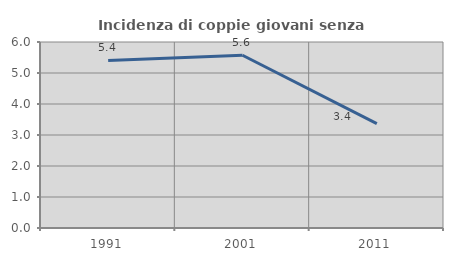
| Category | Incidenza di coppie giovani senza figli |
|---|---|
| 1991.0 | 5.405 |
| 2001.0 | 5.574 |
| 2011.0 | 3.365 |